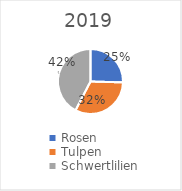
| Category | 2019 |
|---|---|
| Rosen | 0.254 |
| Tulpen | 0.322 |
| Schwertlilien | 0.424 |